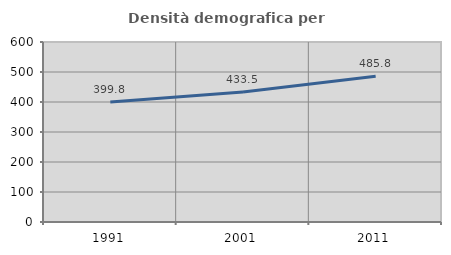
| Category | Densità demografica |
|---|---|
| 1991.0 | 399.82 |
| 2001.0 | 433.525 |
| 2011.0 | 485.843 |